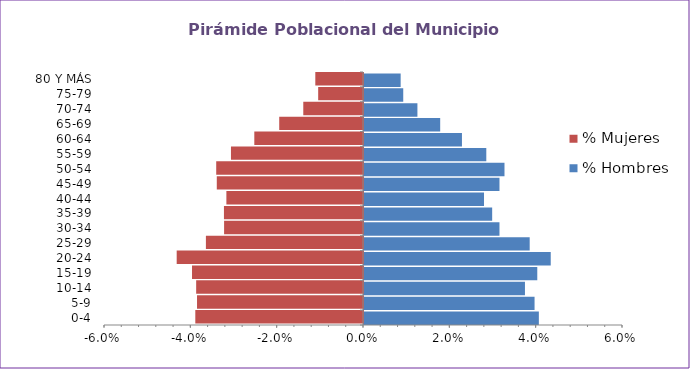
| Category | % Hombres | % Mujeres |
|---|---|---|
| 0-4 | 0.041 | -0.039 |
| 5-9 | 0.04 | -0.038 |
| 10-14 | 0.037 | -0.039 |
| 15-19 | 0.04 | -0.04 |
| 20-24 | 0.043 | -0.043 |
| 25-29 | 0.038 | -0.036 |
| 30-34 | 0.031 | -0.032 |
| 35-39 | 0.03 | -0.032 |
| 40-44 | 0.028 | -0.032 |
| 45-49 | 0.031 | -0.034 |
| 50-54 | 0.033 | -0.034 |
| 55-59 | 0.028 | -0.031 |
| 60-64 | 0.023 | -0.025 |
| 65-69 | 0.018 | -0.019 |
| 70-74 | 0.012 | -0.014 |
| 75-79 | 0.009 | -0.01 |
| 80 Y MÁS | 0.008 | -0.011 |